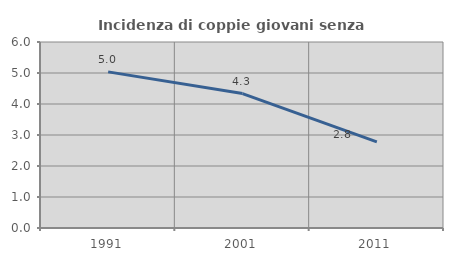
| Category | Incidenza di coppie giovani senza figli |
|---|---|
| 1991.0 | 5.037 |
| 2001.0 | 4.337 |
| 2011.0 | 2.779 |